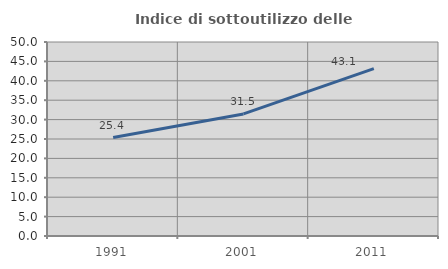
| Category | Indice di sottoutilizzo delle abitazioni  |
|---|---|
| 1991.0 | 25.369 |
| 2001.0 | 31.467 |
| 2011.0 | 43.131 |